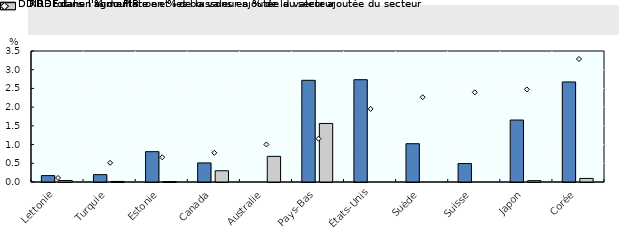
| Category | DIRDE dans l'alimentation et les boissons en % de la valeur ajoutée du secteur | DIRDE dans l'agriculture en % de la valeur ajoutée du secteur |
|---|---|---|
| Lettonie | 0.17 | 0.04 |
| Turquie | 0.197 | 0.015 |
| Estonie | 0.81 | 0.011 |
| Canada | 0.51 | 0.3 |
| Australie | 0 | 0.685 |
| Pays-Bas | 2.717 | 1.564 |
| États-Unis | 2.733 | 0 |
| Suède | 1.023 | 0 |
| Suisse | 0.493 | 0 |
| Japon | 1.656 | 0.036 |
| Corée | 2.673 | 0.096 |